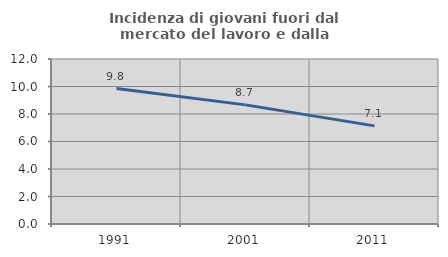
| Category | Incidenza di giovani fuori dal mercato del lavoro e dalla formazione  |
|---|---|
| 1991.0 | 9.849 |
| 2001.0 | 8.663 |
| 2011.0 | 7.136 |